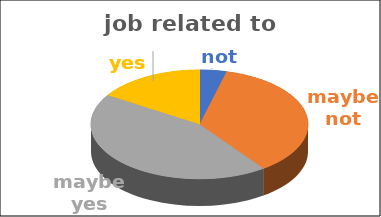
| Category | job related to studies | Series 1 | Series 2 | Series 3 | Series 4 |
|---|---|---|---|---|---|
| not | 0.04 |  |  |  |  |
| maybe not | 0.36 |  |  |  |  |
| maybe yes | 0.44 |  |  |  |  |
| yes | 0.16 |  |  |  |  |